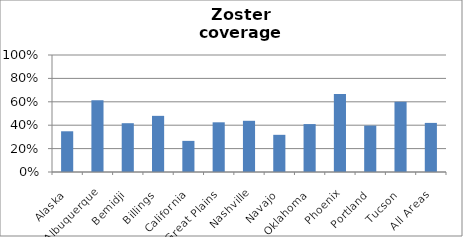
| Category | Zoster |
|---|---|
| Alaska | 0.348 |
| Albuquerque | 0.613 |
| Bemidji | 0.417 |
| Billings | 0.48 |
| California | 0.266 |
| Great Plains | 0.425 |
| Nashville | 0.438 |
| Navajo | 0.318 |
| Oklahoma | 0.41 |
| Phoenix | 0.667 |
| Portland | 0.397 |
| Tucson | 0.601 |
| All Areas | 0.42 |